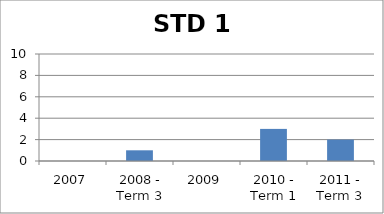
| Category | Rank |
|---|---|
| 2007 | 0 |
| 2008 - Term 3 | 1 |
| 2009 | 0 |
| 2010 - Term 1 | 3 |
| 2011 - Term 3 | 2 |